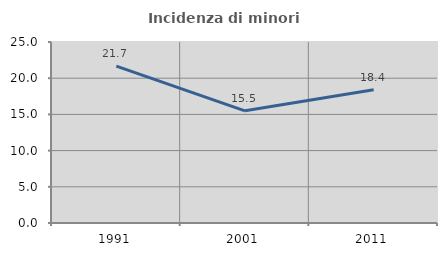
| Category | Incidenza di minori stranieri |
|---|---|
| 1991.0 | 21.667 |
| 2001.0 | 15.493 |
| 2011.0 | 18.405 |